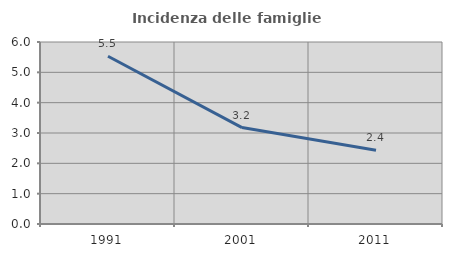
| Category | Incidenza delle famiglie numerose |
|---|---|
| 1991.0 | 5.529 |
| 2001.0 | 3.179 |
| 2011.0 | 2.429 |